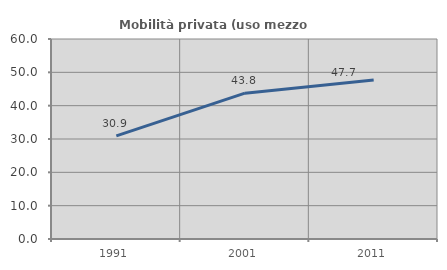
| Category | Mobilità privata (uso mezzo privato) |
|---|---|
| 1991.0 | 30.946 |
| 2001.0 | 43.75 |
| 2011.0 | 47.734 |